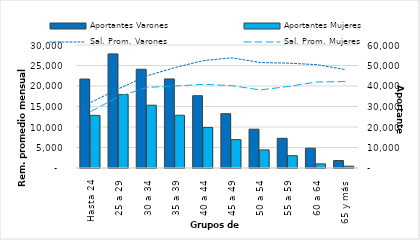
| Category | Aportantes Varones | Aportantes Mujeres |
|---|---|---|
| 0 | 43390 | 25678 |
| 1 | 55669 | 35838 |
| 2 | 48181 | 30636 |
| 3 | 43443 | 25741 |
| 4 | 35265 | 19782 |
| 5 | 26500 | 13843 |
| 6 | 18929 | 8828 |
| 7 | 14493 | 5996 |
| 8 | 9667 | 2018 |
| 9 | 3658 | 878 |